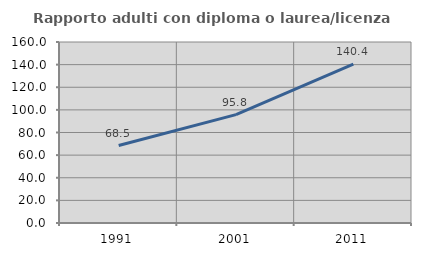
| Category | Rapporto adulti con diploma o laurea/licenza media  |
|---|---|
| 1991.0 | 68.506 |
| 2001.0 | 95.833 |
| 2011.0 | 140.401 |